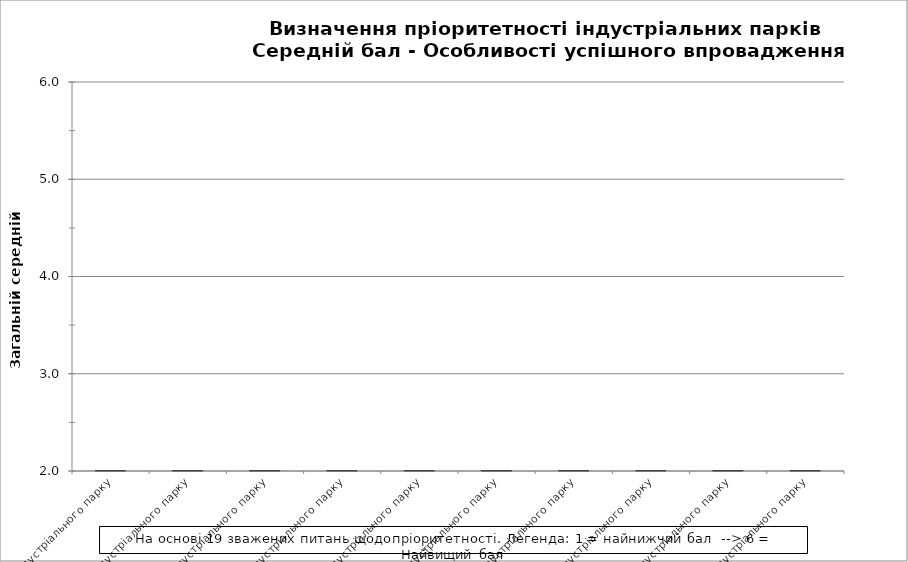
| Category | Series 0 |
|---|---|
| Назва індустріального парку | 0 |
| Назва індустріального парку | 0 |
| Назва індустріального парку | 0 |
| Назва індустріального парку | 0 |
| Назва індустріального парку | 0 |
| Назва індустріального парку | 0 |
| Назва індустріального парку | 0 |
| Назва індустріального парку | 0 |
| Назва індустріального парку | 0 |
| Назва індустріального парку | 0 |